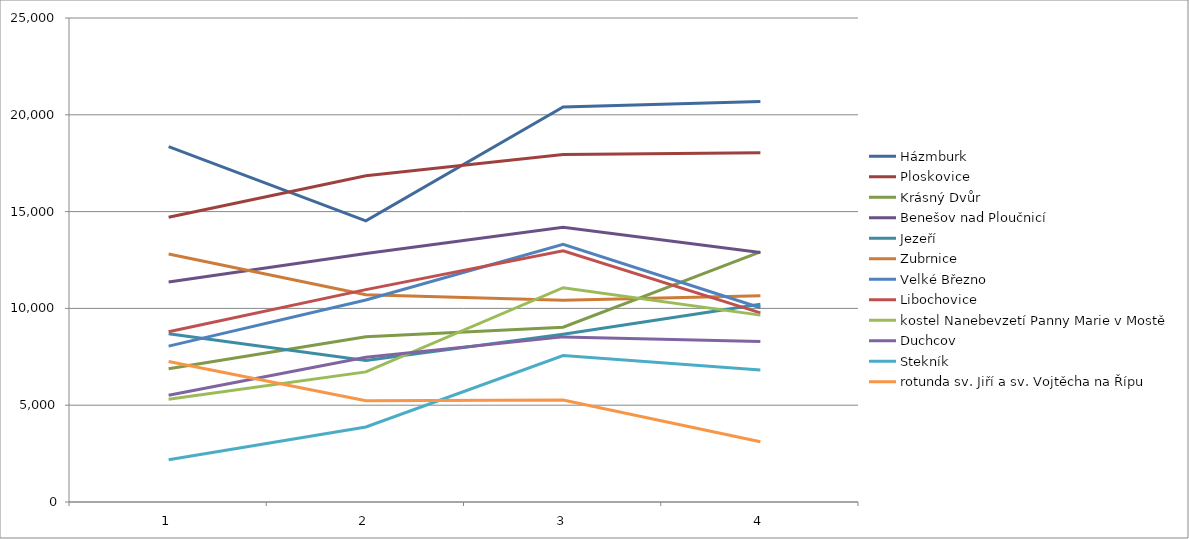
| Category | Házmburk  | Ploskovice  | Krásný Dvůr  | Benešov nad Ploučnicí | Jezeří  | Zubrnice  | Velké Březno  | Libochovice | kostel Nanebevzetí Panny Marie v Mostě | Duchcov | Stekník | rotunda sv. Jiří a sv. Vojtěcha na Řípu |
|---|---|---|---|---|---|---|---|---|---|---|---|---|
| 0 | 18357 | 14708 | 6883 | 11364 | 8691 | 12806 | 8050 | 8790 | 5302 | 5514 | 2186 | 7257 |
| 1 | 14522 | 16855 | 8541 | 12834 | 7310 | 10702 | 10435 | 10970 | 6722 | 7475 | 3874 | 5229 |
| 2 | 20404 | 17953 | 9030 | 14188 | 8666 | 10422 | 13311 | 12971 | 11070 | 8529 | 7566 | 5265 |
| 3 | 20692 | 18042 | 12923 | 12892 | 10215 | 10652 | 10031 | 9772 | 9653 | 8288 | 6817 | 3111 |